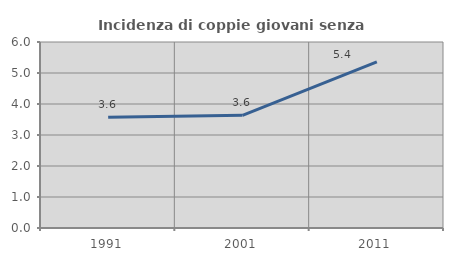
| Category | Incidenza di coppie giovani senza figli |
|---|---|
| 1991.0 | 3.571 |
| 2001.0 | 3.636 |
| 2011.0 | 5.357 |